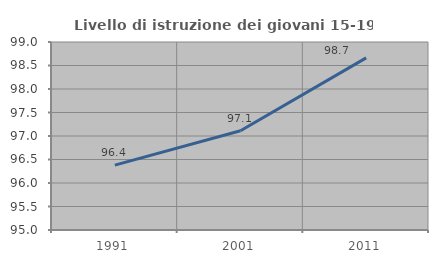
| Category | Livello di istruzione dei giovani 15-19 anni |
|---|---|
| 1991.0 | 96.38 |
| 2001.0 | 97.112 |
| 2011.0 | 98.662 |